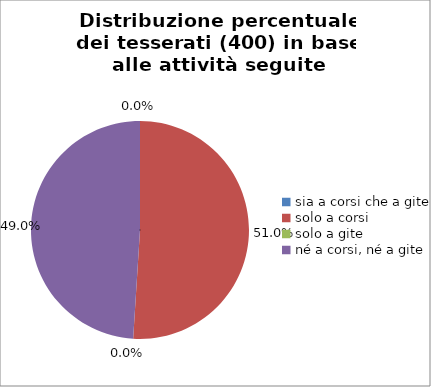
| Category | Nr. Tesserati |
|---|---|
| sia a corsi che a gite | 0 |
| solo a corsi | 204 |
| solo a gite | 0 |
| né a corsi, né a gite | 196 |